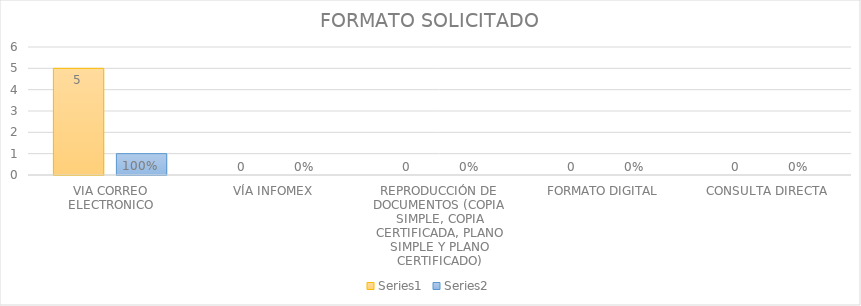
| Category | Series 3 | Series 4 |
|---|---|---|
| VIA CORREO ELECTRONICO | 5 | 1 |
| VÍA INFOMEX | 0 | 0 |
| REPRODUCCIÓN DE DOCUMENTOS (COPIA SIMPLE, COPIA CERTIFICADA, PLANO SIMPLE Y PLANO CERTIFICADO) | 0 | 0 |
| FORMATO DIGITAL | 0 | 0 |
| CONSULTA DIRECTA | 0 | 0 |